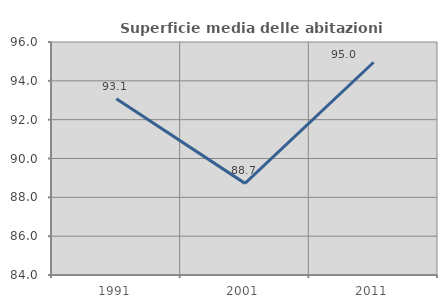
| Category | Superficie media delle abitazioni occupate |
|---|---|
| 1991.0 | 93.076 |
| 2001.0 | 88.719 |
| 2011.0 | 94.958 |